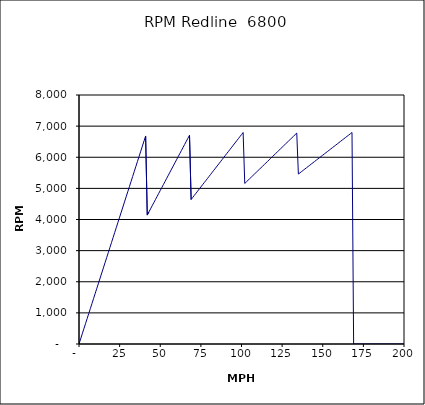
| Category | RPM Redline  6800 |
|---|---|
| 0.0 | 0 |
| 1.0 | 163.016 |
| 2.0 | 326.032 |
| 3.0 | 489.048 |
| 4.0 | 652.064 |
| 5.0 | 815.08 |
| 6.0 | 978.096 |
| 7.0 | 1141.112 |
| 8.0 | 1304.129 |
| 9.0 | 1467.145 |
| 10.0 | 1630.161 |
| 11.0 | 1793.177 |
| 12.0 | 1956.193 |
| 13.0 | 2119.209 |
| 14.0 | 2282.225 |
| 15.0 | 2445.241 |
| 16.0 | 2608.257 |
| 17.0 | 2771.273 |
| 18.0 | 2934.289 |
| 19.0 | 3097.305 |
| 20.0 | 3260.321 |
| 21.0 | 3423.337 |
| 22.0 | 3586.353 |
| 23.0 | 3749.37 |
| 24.0 | 3912.386 |
| 25.0 | 4075.402 |
| 26.0 | 4238.418 |
| 27.0 | 4401.434 |
| 28.0 | 4564.45 |
| 29.0 | 4727.466 |
| 30.0 | 4890.482 |
| 31.0 | 5053.498 |
| 32.0 | 5216.514 |
| 33.0 | 5379.53 |
| 34.0 | 5542.546 |
| 35.0 | 5705.562 |
| 36.0 | 5868.578 |
| 37.0 | 6031.595 |
| 38.0 | 6194.611 |
| 39.0 | 6357.627 |
| 40.0 | 6520.643 |
| 41.0 | 6683.659 |
| 42.0 | 4142.526 |
| 43.0 | 4241.158 |
| 44.0 | 4339.789 |
| 45.0 | 4438.421 |
| 46.0 | 4537.052 |
| 47.0 | 4635.684 |
| 48.0 | 4734.315 |
| 49.0 | 4832.947 |
| 50.0 | 4931.579 |
| 51.0 | 5030.21 |
| 52.0 | 5128.842 |
| 53.0 | 5227.473 |
| 54.0 | 5326.105 |
| 55.0 | 5424.736 |
| 56.0 | 5523.368 |
| 57.0 | 5622 |
| 58.0 | 5720.631 |
| 59.0 | 5819.263 |
| 60.0 | 5917.894 |
| 61.0 | 6016.526 |
| 62.0 | 6115.157 |
| 63.0 | 6213.789 |
| 64.0 | 6312.421 |
| 65.0 | 6411.052 |
| 66.0 | 6509.684 |
| 67.0 | 6608.315 |
| 68.0 | 6706.947 |
| 69.0 | 4642.077 |
| 70.0 | 4709.353 |
| 71.0 | 4776.63 |
| 72.0 | 4843.906 |
| 73.0 | 4911.182 |
| 74.0 | 4978.459 |
| 75.0 | 5045.735 |
| 76.0 | 5113.012 |
| 77.0 | 5180.288 |
| 78.0 | 5247.565 |
| 79.0 | 5314.841 |
| 80.0 | 5382.118 |
| 81.0 | 5449.394 |
| 82.0 | 5516.671 |
| 83.0 | 5583.947 |
| 84.0 | 5651.224 |
| 85.0 | 5718.5 |
| 86.0 | 5785.777 |
| 87.0 | 5853.053 |
| 88.0 | 5920.33 |
| 89.0 | 5987.606 |
| 90.0 | 6054.883 |
| 91.0 | 6122.159 |
| 92.0 | 6189.435 |
| 93.0 | 6256.712 |
| 94.0 | 6323.988 |
| 95.0 | 6391.265 |
| 96.0 | 6458.541 |
| 97.0 | 6525.818 |
| 98.0 | 6593.094 |
| 99.0 | 6660.371 |
| 100.0 | 6727.647 |
| 101.0 | 6794.924 |
| 102.0 | 5157.961 |
| 103.0 | 5208.53 |
| 104.0 | 5259.098 |
| 105.0 | 5309.666 |
| 106.0 | 5360.234 |
| 107.0 | 5410.803 |
| 108.0 | 5461.371 |
| 109.0 | 5511.939 |
| 110.0 | 5562.507 |
| 111.0 | 5613.076 |
| 112.0 | 5663.644 |
| 113.0 | 5714.212 |
| 114.0 | 5764.78 |
| 115.0 | 5815.349 |
| 116.0 | 5865.917 |
| 117.0 | 5916.485 |
| 118.0 | 5967.053 |
| 119.0 | 6017.622 |
| 120.0 | 6068.19 |
| 121.0 | 6118.758 |
| 122.0 | 6169.326 |
| 123.0 | 6219.895 |
| 124.0 | 6270.463 |
| 125.0 | 6321.031 |
| 126.0 | 6371.599 |
| 127.0 | 6422.168 |
| 128.0 | 6472.736 |
| 129.0 | 6523.304 |
| 130.0 | 6573.872 |
| 131.0 | 6624.441 |
| 132.0 | 6675.009 |
| 133.0 | 6725.577 |
| 134.0 | 6776.145 |
| 135.0 | 5460.425 |
| 136.0 | 5500.873 |
| 137.0 | 5541.321 |
| 138.0 | 5581.768 |
| 139.0 | 5622.216 |
| 140.0 | 5662.663 |
| 141.0 | 5703.111 |
| 142.0 | 5743.559 |
| 143.0 | 5784.006 |
| 144.0 | 5824.454 |
| 145.0 | 5864.901 |
| 146.0 | 5905.349 |
| 147.0 | 5945.797 |
| 148.0 | 5986.244 |
| 149.0 | 6026.692 |
| 150.0 | 6067.139 |
| 151.0 | 6107.587 |
| 152.0 | 6148.035 |
| 153.0 | 6188.482 |
| 154.0 | 6228.93 |
| 155.0 | 6269.377 |
| 156.0 | 6309.825 |
| 157.0 | 6350.273 |
| 158.0 | 6390.72 |
| 159.0 | 6431.168 |
| 160.0 | 6471.615 |
| 161.0 | 6512.063 |
| 162.0 | 6552.511 |
| 163.0 | 6592.958 |
| 164.0 | 6633.406 |
| 165.0 | 6673.853 |
| 166.0 | 6714.301 |
| 167.0 | 6754.748 |
| 168.0 | 6795.196 |
| 169.0 | 0 |
| 170.0 | 0 |
| 171.0 | 0 |
| 172.0 | 0 |
| 173.0 | 0 |
| 174.0 | 0 |
| 175.0 | 0 |
| 176.0 | 0 |
| 177.0 | 0 |
| 178.0 | 0 |
| 179.0 | 0 |
| 180.0 | 0 |
| 181.0 | 0 |
| 182.0 | 0 |
| 183.0 | 0 |
| 184.0 | 0 |
| 185.0 | 0 |
| 186.0 | 0 |
| 187.0 | 0 |
| 188.0 | 0 |
| 189.0 | 0 |
| 190.0 | 0 |
| 191.0 | 0 |
| 192.0 | 0 |
| 193.0 | 0 |
| 194.0 | 0 |
| 195.0 | 0 |
| 196.0 | 0 |
| 197.0 | 0 |
| 198.0 | 0 |
| 199.0 | 0 |
| 200.0 | 0 |